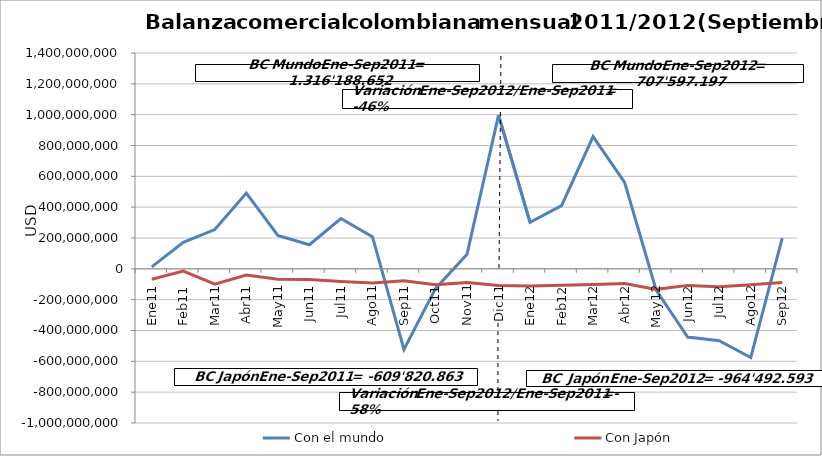
| Category | Con el mundo | Con Japón |
|---|---|---|
| 0 | 12976228.07 | -68020858.69 |
| 1 | 172080876.66 | -14875171.63 |
| 2 | 254737279.24 | -99648583.05 |
| 3 | 491095442.31 | -39945355.18 |
| 4 | 217317087.62 | -67846623.03 |
| 5 | 156393086.3 | -69653001.93 |
| 6 | 326134966.39 | -81454806.95 |
| 7 | 208345592.97 | -91511035.44 |
| 8 | -522891907.61 | -76865427.31 |
| 9 | -128564369.04 | -103134971.69 |
| 10 | 94315805.83 | -87973831.2 |
| 11 | 996753832.74 | -108816257.76 |
| 12 | 301773207.39 | -111775481.73 |
| 13 | 410189041.25 | -107141907.74 |
| 14 | 857833423.7 | -102084580.35 |
| 15 | 561075382.57 | -95475139.65 |
| 16 | -138077862.03 | -133131120.69 |
| 17 | -442796860.29 | -107331170.92 |
| 18 | -466144859.55 | -116218777.37 |
| 19 | -576040883.11 | -103381034.29 |
| 20 | 199786607.19 | -87953380.56 |